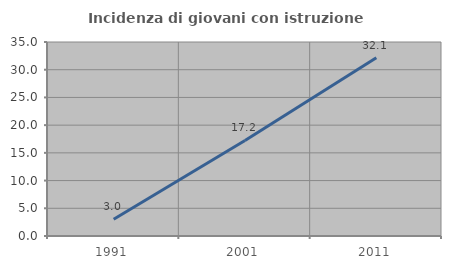
| Category | Incidenza di giovani con istruzione universitaria |
|---|---|
| 1991.0 | 3.03 |
| 2001.0 | 17.241 |
| 2011.0 | 32.143 |